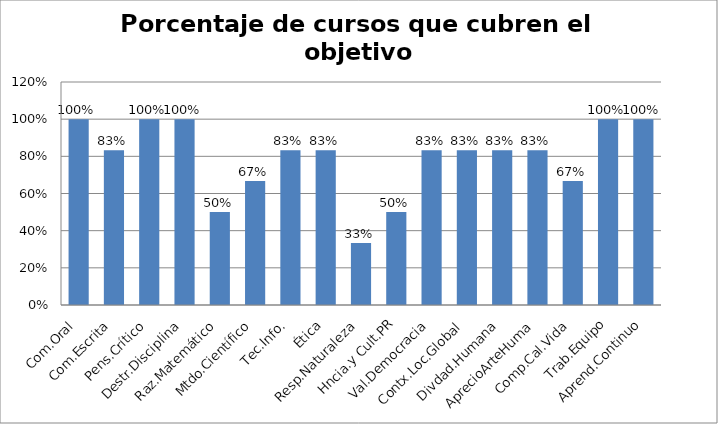
| Category | Series 0 |
|---|---|
| Com.Oral | 1 |
| Com.Escrita | 0.833 |
| Pens.Crítico | 1 |
| Destr.Disciplina | 1 |
| Raz.Matemático | 0.5 |
| Mtdo.Científico | 0.667 |
| Tec.Info. | 0.833 |
| Ética | 0.833 |
| Resp.Naturaleza | 0.333 |
| Hncia.y Cult.PR | 0.5 |
| Val.Democracia | 0.833 |
| Contx.Loc.Global | 0.833 |
| Divdad.Humana | 0.833 |
| AprecioArteHuma | 0.833 |
| Comp.Cal.Vida | 0.667 |
| Trab.Equipo | 1 |
| Aprend.Continuo | 1 |